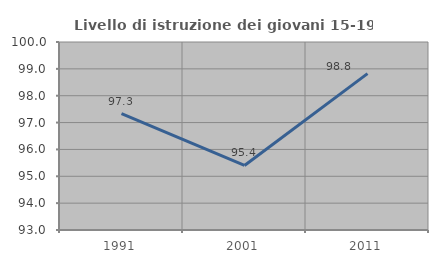
| Category | Livello di istruzione dei giovani 15-19 anni |
|---|---|
| 1991.0 | 97.333 |
| 2001.0 | 95.402 |
| 2011.0 | 98.824 |